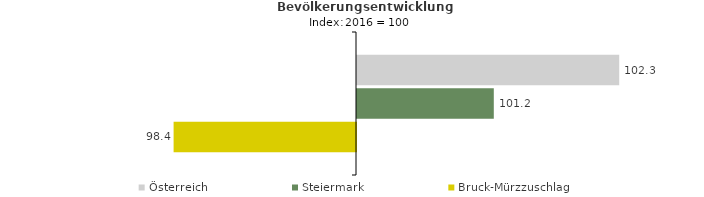
| Category | Österreich | Steiermark | Bruck-Mürzzuschlag |
|---|---|---|---|
| 2020.0 | 102.3 | 101.2 | 98.4 |